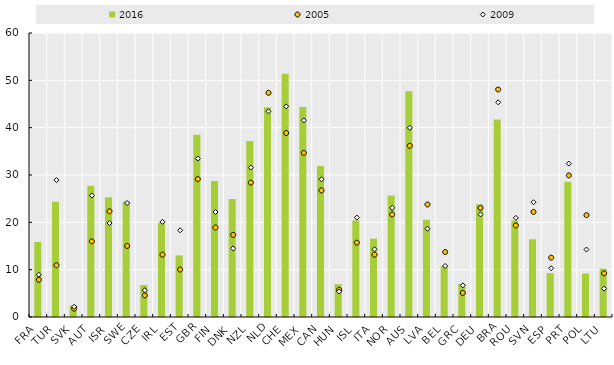
| Category | 2016 |
|---|---|
| FRA | 15.851 |
| TUR | 24.351 |
| SVK | 2.419 |
| AUT | 27.753 |
| ISR | 25.317 |
| SWE | 24.401 |
| CZE | 6.764 |
| IRL | 19.93 |
| EST | 13.021 |
| GBR | 38.485 |
| FIN | 28.714 |
| DNK | 24.936 |
| NZL | 37.197 |
| NLD | 44.306 |
| CHE | 51.369 |
| MEX | 44.392 |
| CAN | 31.879 |
| HUN | 6.916 |
| ISL | 20.398 |
| ITA | 16.553 |
| NOR | 25.656 |
| AUS | 47.706 |
| LVA | 20.549 |
| BEL | 10.773 |
| GRC | 7.002 |
| DEU | 23.813 |
| BRA | 41.726 |
| ROU | 20.376 |
| SVN | 16.431 |
| ESP | 9.279 |
| PRT | 28.571 |
| POL | 9.205 |
| LTU | 10.211 |